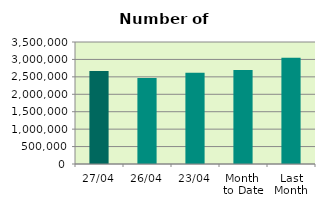
| Category | Series 0 |
|---|---|
| 27/04 | 2667306 |
| 26/04 | 2465844 |
| 23/04 | 2620774 |
| Month 
to Date | 2694089.059 |
| Last
Month | 3050763.217 |